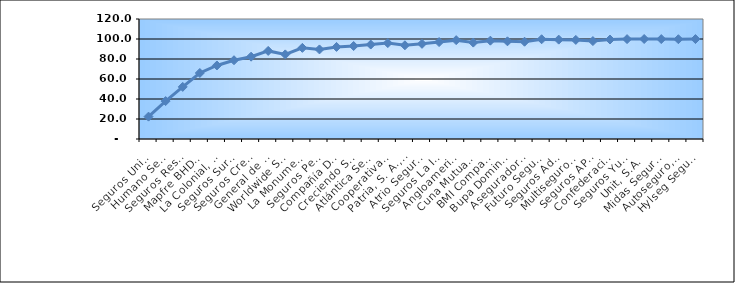
| Category | Series 0 |
|---|---|
| Seguros Universal, S. A. | 22.365 |
| Humano Seguros, S. A. | 37.914 |
| Seguros Reservas, S. A. | 52.095 |
| Mapfre BHD Compañía de Seguros | 66.014 |
| La Colonial, S. A., Compañia De Seguros | 73.521 |
| Seguros Sura, S.A. | 78.755 |
| Seguros Crecer, S. A. | 82.324 |
| General de Seguros, S. A. | 88.092 |
| Worldwide Seguros, S. A. | 84.625 |
| La Monumental de Seguros, S. A. | 91.135 |
| Seguros Pepín, S. A. | 89.575 |
| Compañía Dominicana de Seguros, C. por A. | 92.077 |
| Creciendo Seguros | 92.992 |
| Atlántica Seguros, S. A. | 94.463 |
| Cooperativa Nacional De Seguros, Inc  | 95.911 |
| Patria, S. A., Compañía de Seguros | 93.704 |
| Atrio Seguros S. A. | 95.16 |
| Seguros La Internacional, S. A. | 96.924 |
| Angloamericana de Seguros, S. A. | 98.858 |
| Cuna Mutual Insurance Society Dominicana | 96.398 |
| BMI Compañía de Seguros, S. A. | 98.342 |
| Bupa Dominicana, S. A. | 97.689 |
| Aseguradora Agropecuaria Dominicana, S. A. | 97.272 |
| Futuro Seguros | 99.747 |
| Seguros Ademi, S.A. | 99.361 |
| Multiseguros Su, S.A. | 99.087 |
| Seguros APS, S.R.L. | 97.912 |
| Confederación del Canadá Dominicana, S. A. | 99.472 |
| Seguros Yunen, S.A. | 99.889 |
| Unit, S.A. | 100 |
| Midas Seguros, S.A. | 99.937 |
| Autoseguro, S. A. | 99.792 |
| Hylseg Seguros S.A | 99.948 |